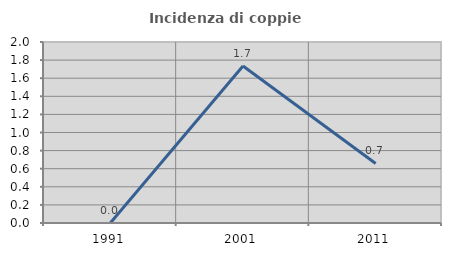
| Category | Incidenza di coppie miste |
|---|---|
| 1991.0 | 0 |
| 2001.0 | 1.734 |
| 2011.0 | 0.658 |